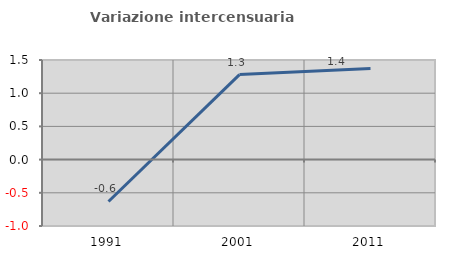
| Category | Variazione intercensuaria annua |
|---|---|
| 1991.0 | -0.631 |
| 2001.0 | 1.28 |
| 2011.0 | 1.372 |